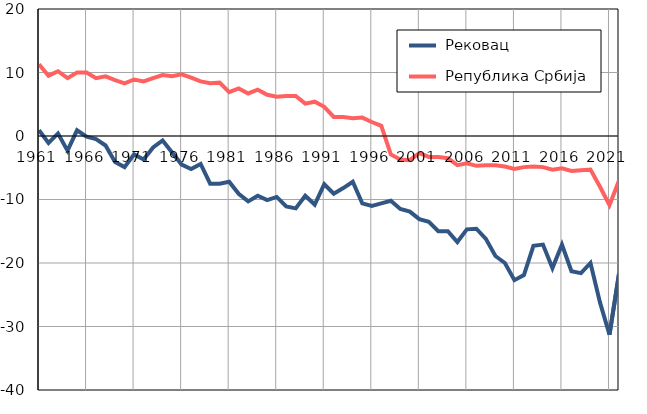
| Category |  Рековац |  Република Србија |
|---|---|---|
| 1961.0 | 0.9 | 11.3 |
| 1962.0 | -1.1 | 9.5 |
| 1963.0 | 0.4 | 10.2 |
| 1964.0 | -2.3 | 9.1 |
| 1965.0 | 0.9 | 10 |
| 1966.0 | -0.1 | 10 |
| 1967.0 | -0.5 | 9.1 |
| 1968.0 | -1.5 | 9.4 |
| 1969.0 | -4.1 | 8.8 |
| 1970.0 | -4.9 | 8.3 |
| 1971.0 | -2.9 | 8.9 |
| 1972.0 | -3.7 | 8.6 |
| 1973.0 | -1.8 | 9.1 |
| 1974.0 | -0.7 | 9.6 |
| 1975.0 | -2.6 | 9.4 |
| 1976.0 | -4.5 | 9.7 |
| 1977.0 | -5.2 | 9.2 |
| 1978.0 | -4.4 | 8.6 |
| 1979.0 | -7.5 | 8.3 |
| 1980.0 | -7.5 | 8.4 |
| 1981.0 | -7.2 | 6.9 |
| 1982.0 | -9.1 | 7.5 |
| 1983.0 | -10.3 | 6.7 |
| 1984.0 | -9.4 | 7.3 |
| 1985.0 | -10.1 | 6.5 |
| 1986.0 | -9.6 | 6.2 |
| 1987.0 | -11.1 | 6.3 |
| 1988.0 | -11.4 | 6.3 |
| 1989.0 | -9.4 | 5.1 |
| 1990.0 | -10.8 | 5.4 |
| 1991.0 | -7.6 | 4.6 |
| 1992.0 | -9.1 | 3 |
| 1993.0 | -8.2 | 3 |
| 1994.0 | -7.2 | 2.8 |
| 1995.0 | -10.6 | 2.9 |
| 1996.0 | -11 | 2.2 |
| 1997.0 | -10.6 | 1.6 |
| 1998.0 | -10.2 | -2.9 |
| 1999.0 | -11.5 | -3.7 |
| 2000.0 | -11.9 | -3.8 |
| 2001.0 | -13.1 | -2.7 |
| 2002.0 | -13.5 | -3.3 |
| 2003.0 | -15 | -3.3 |
| 2004.0 | -15 | -3.5 |
| 2005.0 | -16.7 | -4.6 |
| 2006.0 | -14.7 | -4.3 |
| 2007.0 | -14.6 | -4.7 |
| 2008.0 | -16.2 | -4.6 |
| 2009.0 | -18.9 | -4.6 |
| 2010.0 | -20 | -4.8 |
| 2011.0 | -22.7 | -5.2 |
| 2012.0 | -21.9 | -4.9 |
| 2013.0 | -17.3 | -4.8 |
| 2014.0 | -17.1 | -4.9 |
| 2015.0 | -20.8 | -5.3 |
| 2016.0 | -17.1 | -5.1 |
| 2017.0 | -21.3 | -5.5 |
| 2018.0 | -21.6 | -5.4 |
| 2019.0 | -20 | -5.3 |
| 2020.0 | -26.2 | -8 |
| 2021.0 | -31.3 | -10.9 |
| 2022.0 | -21.7 | -7 |